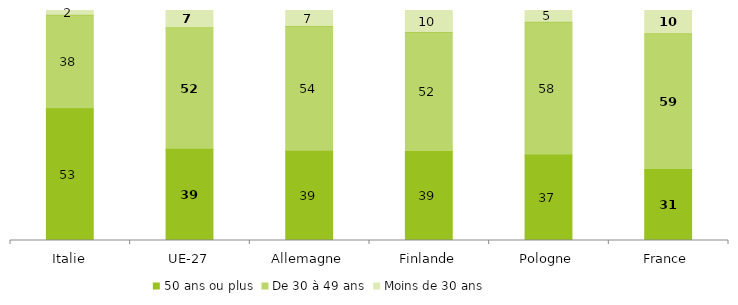
| Category | 50 ans ou plus | De 30 à 49 ans | Moins de 30 ans |
|---|---|---|---|
| Italie | 53.008 | 37.517 | 1.931 |
| UE-27 | 39.216 | 52.222 | 7.468 |
| Allemagne | 38.756 | 54.07 | 6.941 |
| Finlande | 38.688 | 51.7 | 9.611 |
| Pologne | 37.2 | 57.728 | 5.071 |
| France | 30.873 | 58.998 | 10.129 |